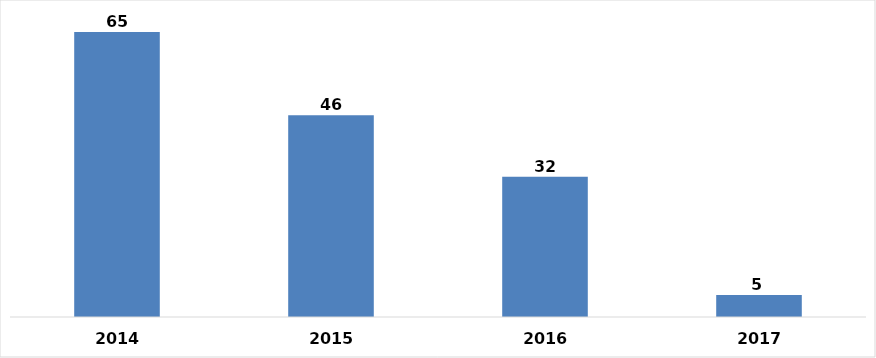
| Category | 2014 |
|---|---|
| 0 | 65 |
| 1 | 46 |
| 2 | 32 |
| 3 | 5 |